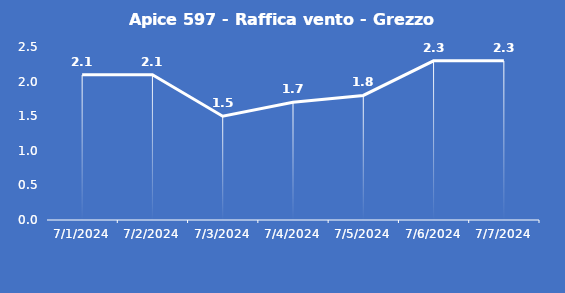
| Category | Apice 597 - Raffica vento - Grezzo (m/s) |
|---|---|
| 7/1/24 | 2.1 |
| 7/2/24 | 2.1 |
| 7/3/24 | 1.5 |
| 7/4/24 | 1.7 |
| 7/5/24 | 1.8 |
| 7/6/24 | 2.3 |
| 7/7/24 | 2.3 |